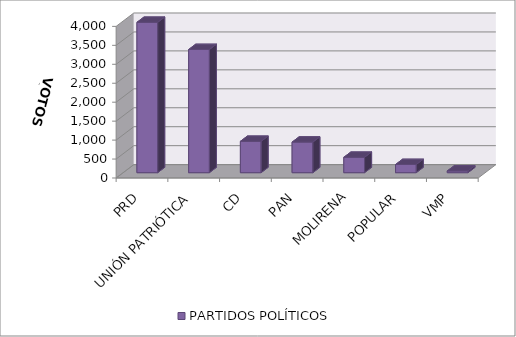
| Category | PARTIDOS POLÍTICOS |
|---|---|
| PRD | 3967 |
| UNIÓN PATRIÓTICA | 3250 |
| CD | 827 |
| PAN | 807 |
| MOLIRENA | 406 |
| POPULAR | 216 |
| VMP | 46 |